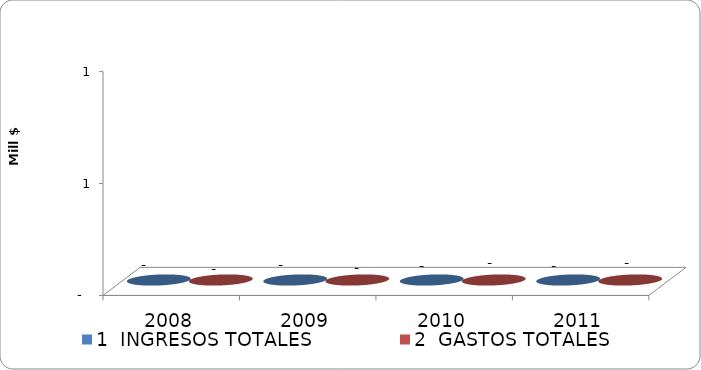
| Category | 1  INGRESOS TOTALES | 2  GASTOS TOTALES |
|---|---|---|
| 2008.0 | 0 | 0 |
| 2009.0 | 0 | 0 |
| 2010.0 | 0 | 0 |
| 2011.0 | 0 | 0 |